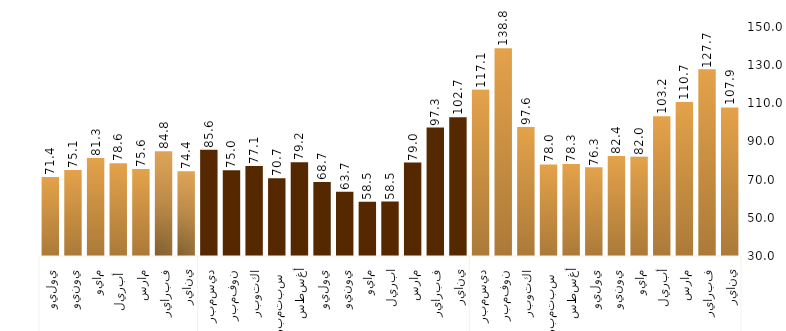
| Category | Series 0 |
|---|---|
| 0 | 107.861 |
| 1 | 127.674 |
| 2 | 110.742 |
| 3 | 103.239 |
| 4 | 82.016 |
| 5 | 82.421 |
| 6 | 76.314 |
| 7 | 78.265 |
| 8 | 77.961 |
| 9 | 97.566 |
| 10 | 138.85 |
| 11 | 117.091 |
| 12 | 102.678 |
| 13 | 97.332 |
| 14 | 78.955 |
| 15 | 58.549 |
| 16 | 58.455 |
| 17 | 63.691 |
| 18 | 68.721 |
| 19 | 79.161 |
| 20 | 70.692 |
| 21 | 77.111 |
| 22 | 74.955 |
| 23 | 85.627 |
| 24 | 74.378 |
| 25 | 84.831 |
| 26 | 75.573 |
| 27 | 78.621 |
| 28 | 81.312 |
| 29 | 75.092 |
| 30 | 71.411 |